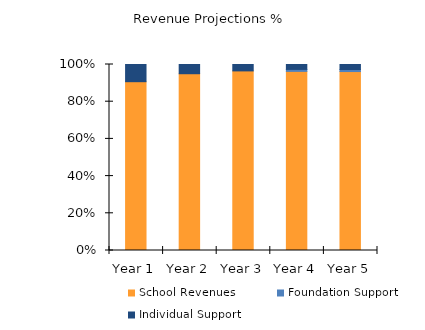
| Category | School Revenues | Foundation Support | Individual Support |
|---|---|---|---|
| 1.0 | 200000 | 0 | 20375 |
| 2.0 | 400000 | 0 | 20881.25 |
| 3.0 | 600000 | 0 | 21402.688 |
| 4.0 | 800000 | 8775.907 | 21939.768 |
| 5.0 | 800000 | 8997.184 | 22492.961 |